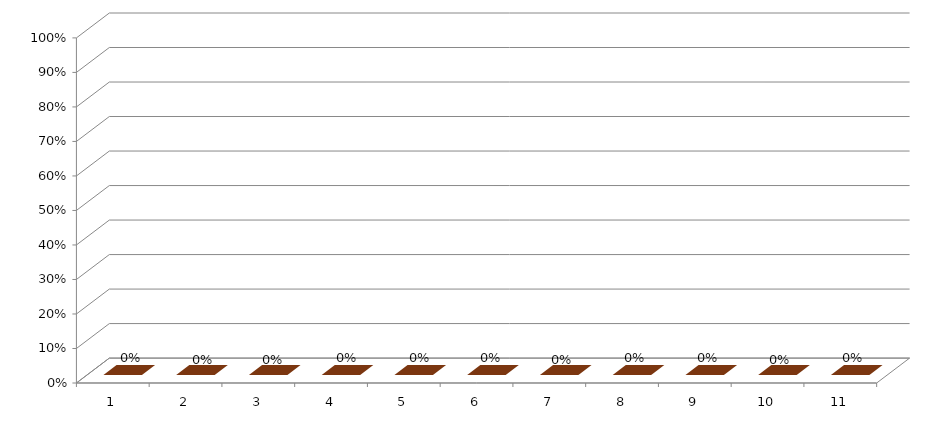
| Category | Series 3 |
|---|---|
| 1.0 | 0 |
| 2.0 | 0 |
| 3.0 | 0 |
| 4.0 | 0 |
| 5.0 | 0 |
| 6.0 | 0 |
| 7.0 | 0 |
| 8.0 | 0 |
| 9.0 | 0 |
| 10.0 | 0 |
| 11.0 | 0 |